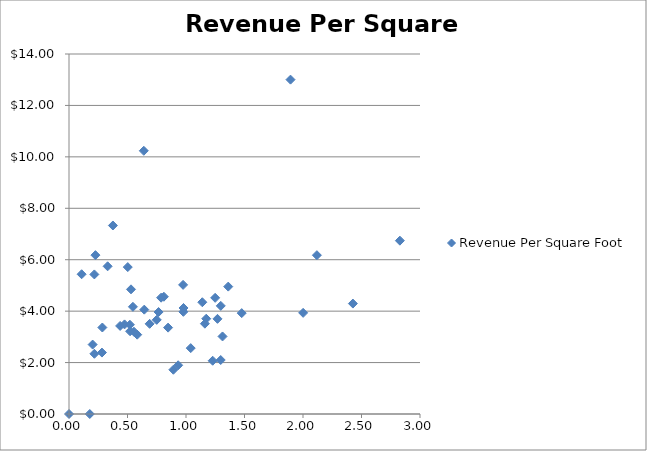
| Category | Revenue Per Square Foot |
|---|---|
| 1.893234914815566 | 13.003 |
| 0.639242114548991 | 10.236 |
| 0.3753457446143 | 7.331 |
| 2.828094288663584 | 6.741 |
| 0.225842222106792 | 6.178 |
| 2.118752167396988 | 6.177 |
| 0.33016627817996 | 5.744 |
| 0.502290444426585 | 5.714 |
| 0.107933430977111 | 5.435 |
| 0.216739492856421 | 5.428 |
| 0.975304554577886 | 5.022 |
| 1.36107272555752 | 4.954 |
| 0.530031223448028 | 4.848 |
| 0.81087172725676 | 4.56 |
| 0.787178683014211 | 4.524 |
| 1.249267019566606 | 4.518 |
| 1.139410696787621 | 4.346 |
| 2.426450739511414 | 4.294 |
| 1.29714277106518 | 4.205 |
| 0.546357414879538 | 4.168 |
| 0.978655210727338 | 4.122 |
| 0.643519188203342 | 4.058 |
| 0.977453059725895 | 3.973 |
| 0.76551019340615 | 3.965 |
| 2.001227524599735 | 3.934 |
| 1.476105719310962 | 3.923 |
| 1.17314974401475 | 3.705 |
| 1.269008622078713 | 3.7 |
| 0.749993602995739 | 3.661 |
| 1.161530390835907 | 3.512 |
| 0.689348418027446 | 3.507 |
| 0.474768181247501 | 3.484 |
| 0.520481698376394 | 3.472 |
| 0.437067394335315 | 3.425 |
| 0.285017485822755 | 3.364 |
| 0.847067997409165 | 3.359 |
| 0.522046820291125 | 3.217 |
| 0.555442204202031 | 3.198 |
| 0.583006792372076 | 3.084 |
| 1.312332021501248 | 3.016 |
| 0.202139648175942 | 2.7 |
| 1.04033146055419 | 2.562 |
| 0.281598522170956 | 2.389 |
| 0.21708573258294 | 2.342 |
| 1.296826839969465 | 2.1 |
| 1.22822962981159 | 2.071 |
| 0.932997205540084 | 1.895 |
| 0.892072596867933 | 1.721 |
| 0.0 | 0 |
| 0.177422617125541 | 0 |